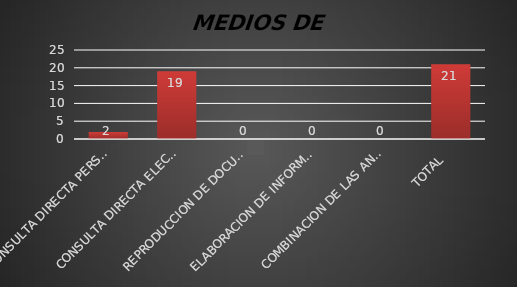
| Category | Series 1 |
|---|---|
| CONSULTA DIRECTA PERSONAL | 2 |
| CONSULTA DIRECTA ELECTRONICA | 19 |
| REPRODUCCION DE DOCUMENTOS  | 0 |
| ELABORACION DE INFORMES ESPECIFICOS  | 0 |
| COMBINACION DE LAS ANTERIORES | 0 |
| TOTAL  | 21 |